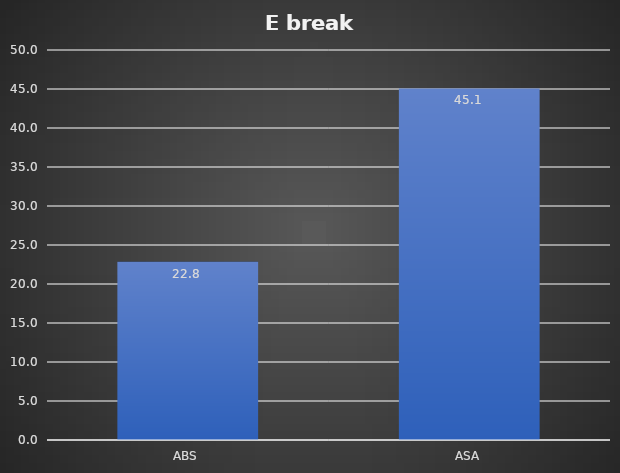
| Category | kJ/m² |
|---|---|
| ABS | 22.839 |
| ASA | 45.065 |